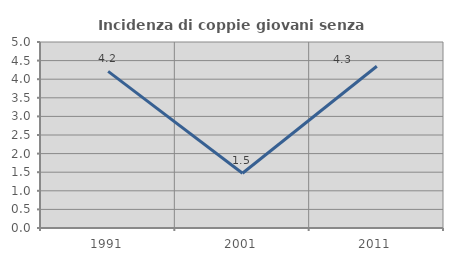
| Category | Incidenza di coppie giovani senza figli |
|---|---|
| 1991.0 | 4.211 |
| 2001.0 | 1.471 |
| 2011.0 | 4.348 |